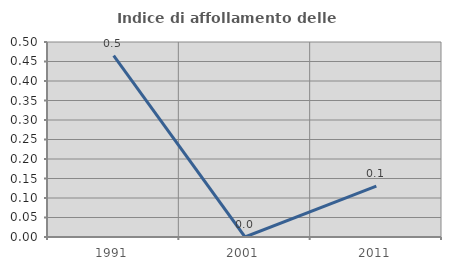
| Category | Indice di affollamento delle abitazioni  |
|---|---|
| 1991.0 | 0.465 |
| 2001.0 | 0 |
| 2011.0 | 0.13 |